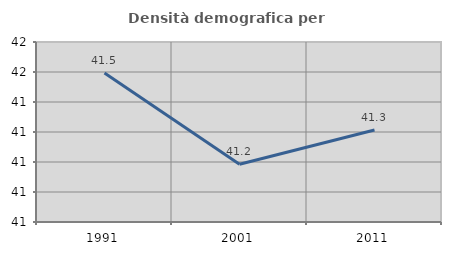
| Category | Densità demografica |
|---|---|
| 1991.0 | 41.496 |
| 2001.0 | 41.192 |
| 2011.0 | 41.306 |